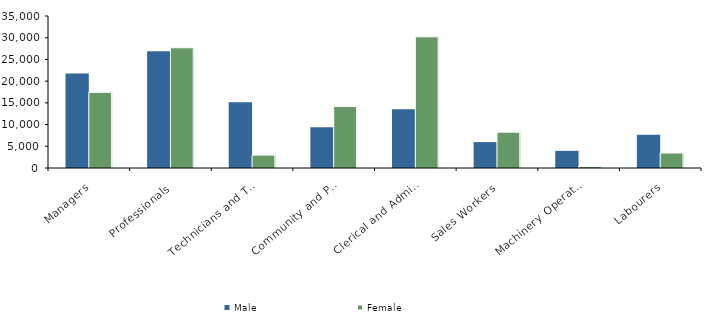
| Category | Male | Female |
|---|---|---|
| Managers | 21755 | 17429 |
| Professionals | 26863 | 27691 |
| Technicians and Trades Workers | 15131 | 2976 |
| Community and Personal Service Workers | 9383 | 14169 |
| Clerical and Administrative Workers | 13554 | 30205 |
| Sales Workers | 5969 | 8250 |
| Machinery Operators and Drivers | 3951 | 357 |
| Labourers | 7647 | 3452 |